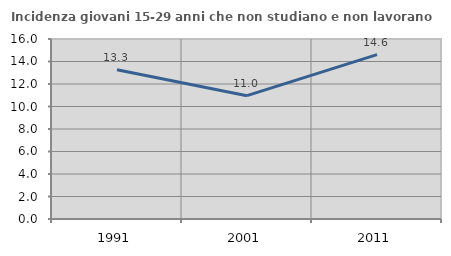
| Category | Incidenza giovani 15-29 anni che non studiano e non lavorano  |
|---|---|
| 1991.0 | 13.274 |
| 2001.0 | 10.962 |
| 2011.0 | 14.611 |